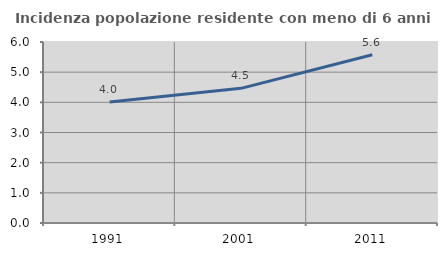
| Category | Incidenza popolazione residente con meno di 6 anni |
|---|---|
| 1991.0 | 4.012 |
| 2001.0 | 4.464 |
| 2011.0 | 5.576 |